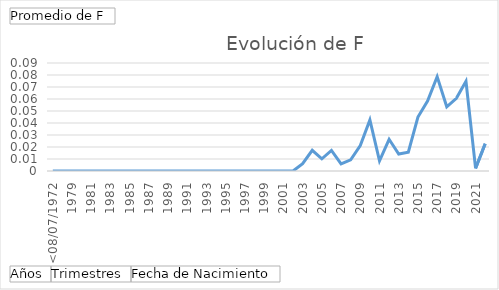
| Category | Total |
|---|---|
| <08/07/1972 | 0 |
| 1972 | 0 |
| 1979 | 0 |
| 1980 | 0 |
| 1981 | 0 |
| 1982 | 0 |
| 1983 | 0 |
| 1984 | 0 |
| 1985 | 0 |
| 1986 | 0 |
| 1987 | 0 |
| 1988 | 0 |
| 1989 | 0 |
| 1990 | 0 |
| 1991 | 0 |
| 1992 | 0 |
| 1993 | 0 |
| 1994 | 0 |
| 1995 | 0 |
| 1996 | 0 |
| 1997 | 0 |
| 1998 | 0 |
| 1999 | 0 |
| 2000 | 0 |
| 2001 | 0 |
| 2002 | 0 |
| 2003 | 0.006 |
| 2004 | 0.017 |
| 2005 | 0.01 |
| 2006 | 0.017 |
| 2007 | 0.006 |
| 2008 | 0.009 |
| 2009 | 0.021 |
| 2010 | 0.043 |
| 2011 | 0.008 |
| 2012 | 0.026 |
| 2013 | 0.014 |
| 2014 | 0.016 |
| 2015 | 0.045 |
| 2016 | 0.058 |
| 2017 | 0.079 |
| 2018 | 0.054 |
| 2019 | 0.061 |
| 2020 | 0.075 |
| 2021 | 0.002 |
| 2022 | 0.023 |